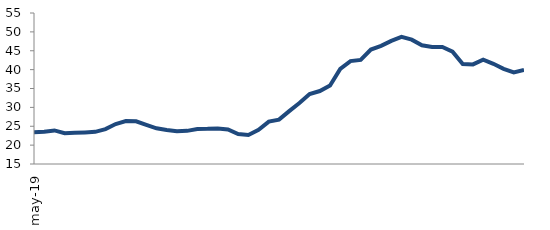
| Category | Series 0 |
|---|---|
| 2019-05-01 | 23.44 |
| 2019-06-01 | 23.564 |
| 2019-07-01 | 23.893 |
| 2019-08-01 | 23.133 |
| 2019-09-01 | 23.263 |
| 2019-10-01 | 23.369 |
| 2019-11-01 | 23.525 |
| 2019-12-01 | 24.256 |
| 2020-01-01 | 25.597 |
| 2020-02-01 | 26.375 |
| 2020-03-01 | 26.322 |
| 2020-04-01 | 25.369 |
| 2020-05-01 | 24.446 |
| 2020-06-01 | 24.028 |
| 2020-07-01 | 23.685 |
| 2020-08-01 | 23.782 |
| 2020-09-01 | 24.28 |
| 2020-10-01 | 24.323 |
| 2020-11-01 | 24.433 |
| 2020-12-01 | 24.131 |
| 2021-01-01 | 22.928 |
| 2021-02-01 | 22.701 |
| 2021-03-01 | 24.039 |
| 2021-04-01 | 26.229 |
| 2021-05-01 | 26.758 |
| 2021-06-01 | 29.013 |
| 2021-07-01 | 31.153 |
| 2021-08-01 | 33.54 |
| 2021-09-01 | 34.33 |
| 2021-10-01 | 35.804 |
| 2021-11-01 | 40.209 |
| 2021-12-01 | 42.248 |
| 2022-01-01 | 42.562 |
| 2022-02-01 | 45.314 |
| 2022-03-01 | 46.285 |
| 2022-04-01 | 47.614 |
| 2022-05-01 | 48.674 |
| 2022-06-01 | 47.931 |
| 2022-07-01 | 46.442 |
| 2022-08-01 | 46 |
| 2022-09-01 | 45.983 |
| 2022-10-01 | 44.739 |
| 2022-11-01 | 41.492 |
| 2022-12-01 | 41.391 |
| 2023-01-01 | 42.634 |
| 2023-02-01 | 41.54 |
| 2023-03-01 | 40.198 |
| 2023-04-01 | 39.238 |
| 2023-05-01 | 39.944 |